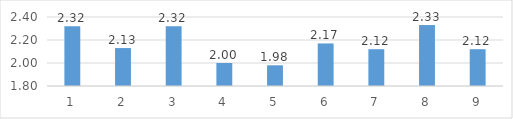
| Category | Series 0 |
|---|---|
| 0 | 2.32 |
| 1 | 2.13 |
| 2 | 2.32 |
| 3 | 2 |
| 4 | 1.98 |
| 5 | 2.17 |
| 6 | 2.12 |
| 7 | 2.33 |
| 8 | 2.12 |